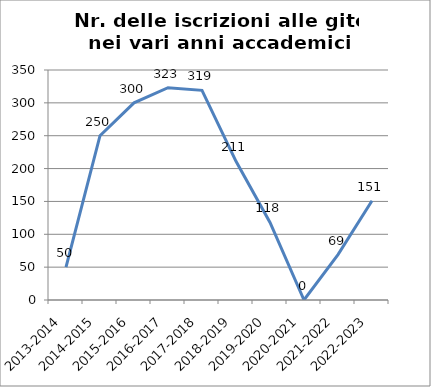
| Category | Nr. Iscrizioni alle Gite |
|---|---|
| 2013-2014 | 50 |
| 2014-2015 | 250 |
| 2015-2016 | 300 |
| 2016-2017 | 323 |
| 2017-2018 | 319 |
| 2018-2019 | 211 |
| 2019-2020 | 118 |
| 2020-2021 | 0 |
| 2021-2022 | 69 |
| 2022-2023 | 151 |